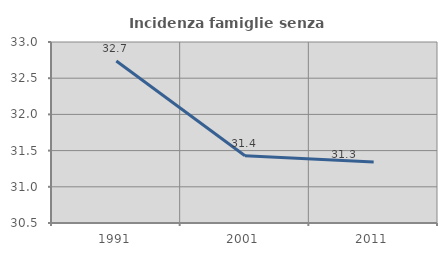
| Category | Incidenza famiglie senza nuclei |
|---|---|
| 1991.0 | 32.738 |
| 2001.0 | 31.429 |
| 2011.0 | 31.343 |